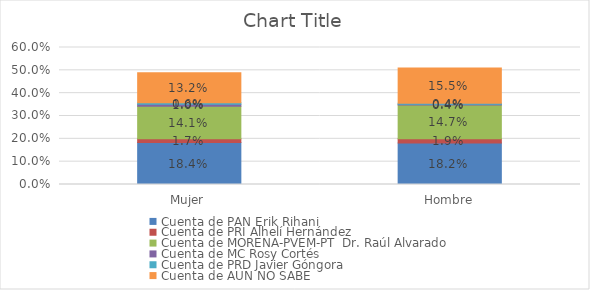
| Category | Cuenta de PAN Erik Rihani | Cuenta de PRI Alhelí Hernández | Cuenta de MORENA-PVEM-PT  Dr. Raúl Alvarado | Cuenta de MC Rosy Cortés | Cuenta de PRD Javier Góngora | Cuenta de AUN NO SABE |
|---|---|---|---|---|---|---|
| Mujer | 0.184 | 0.017 | 0.141 | 0.01 | 0.006 | 0.132 |
| Hombre | 0.182 | 0.019 | 0.147 | 0.004 | 0.004 | 0.155 |